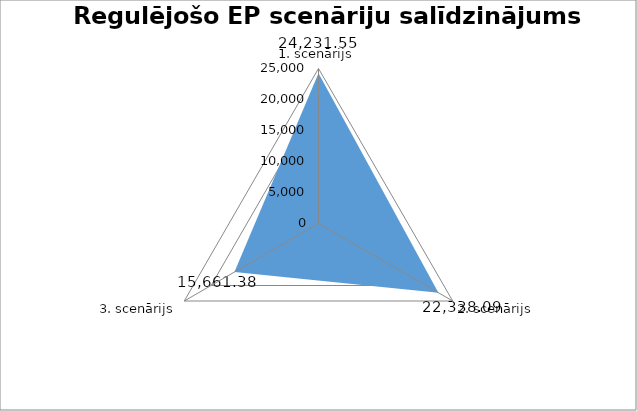
| Category | Series 0 |
|---|---|
| 1. scenārijs | 24231.553 |
| 2. scenārijs | 22338.086 |
| 3. scenārijs | 15661.38 |